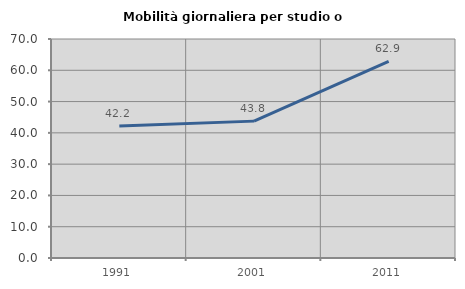
| Category | Mobilità giornaliera per studio o lavoro |
|---|---|
| 1991.0 | 42.188 |
| 2001.0 | 43.75 |
| 2011.0 | 62.887 |